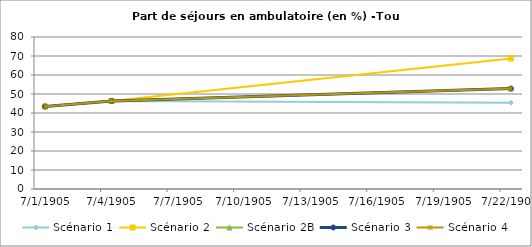
| Category | Scénario 1 | Scénario 2 | Scénario 2B | Scénario 3 | Scénario 4 |
|---|---|---|---|---|---|
| 2009.0 | 43.473 | 43.473 | 43.473 | 43.473 | 43.473 |
| 2012.0 | 46.371 | 46.371 | 46.371 | 46.371 | 46.371 |
| 2030.0 | 45.406 | 68.711 | 52.897 | 52.897 | 52.897 |